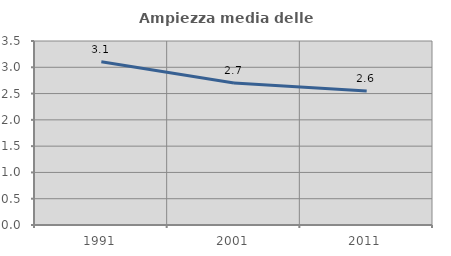
| Category | Ampiezza media delle famiglie |
|---|---|
| 1991.0 | 3.107 |
| 2001.0 | 2.701 |
| 2011.0 | 2.55 |